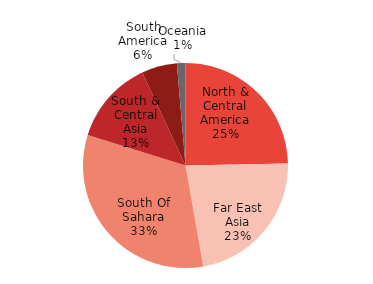
| Category | Series 0 |
|---|---|
| North & Central America | 6526758 |
| Far East Asia | 5948787 |
| South Of Sahara | 8611797 |
| South & Central Asia | 3501672 |
| South America | 1472671 |
| Oceania | 355000 |